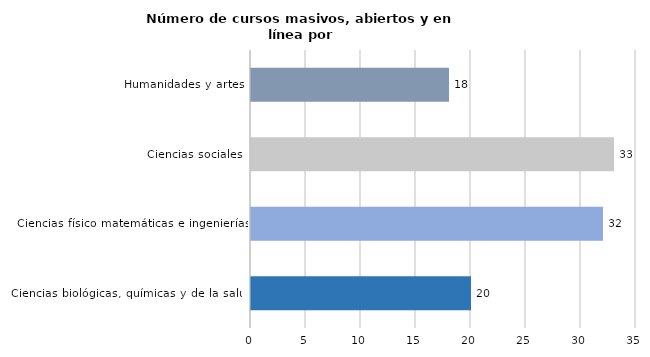
| Category | Series 0 |
|---|---|
| Ciencias biológicas, químicas y de la salud | 20 |
| Ciencias físico matemáticas e ingenierías | 32 |
| Ciencias sociales | 33 |
| Humanidades y artes | 18 |